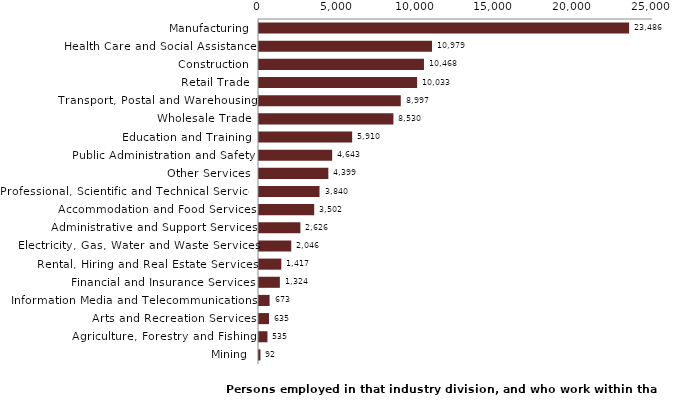
| Category | Series 0 |
|---|---|
| Manufacturing | 23486 |
| Health Care and Social Assistance | 10979 |
| Construction | 10468 |
| Retail Trade | 10033 |
| Transport, Postal and Warehousing | 8997 |
| Wholesale Trade | 8530 |
| Education and Training | 5910 |
| Public Administration and Safety | 4643 |
| Other Services | 4399 |
| Professional, Scientific and Technical Services | 3840 |
| Accommodation and Food Services | 3502 |
| Administrative and Support Services | 2626 |
| Electricity, Gas, Water and Waste Services | 2046 |
| Rental, Hiring and Real Estate Services | 1417 |
| Financial and Insurance Services | 1324 |
| Information Media and Telecommunications | 673 |
| Arts and Recreation Services | 635 |
| Agriculture, Forestry and Fishing | 535 |
| Mining | 92 |